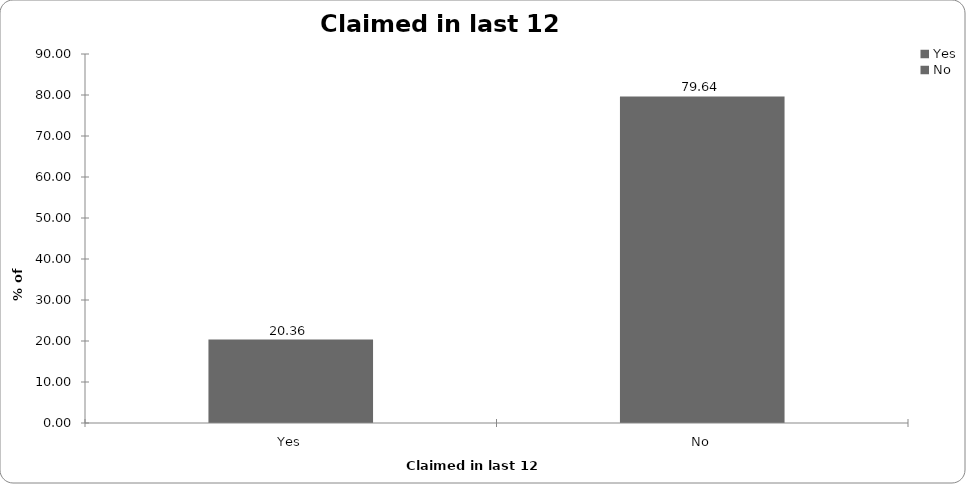
| Category | Claimed in last 12 months |
|---|---|
| Yes | 20.36 |
| No | 79.64 |